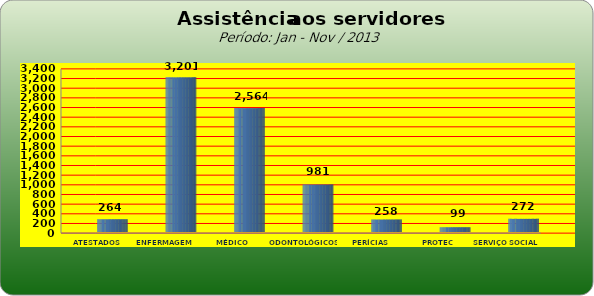
| Category | Series 0 |
|---|---|
| ATESTADOS MÉDICOS | 264 |
| ENFERMAGEM | 3201 |
| MÉDICO | 2564 |
| ODONTOLÓGICOS | 981 |
| PERÍCIAS MÉDICAS | 258 |
| PROTEC | 99 |
| SERVIÇO SOCIAL | 272 |